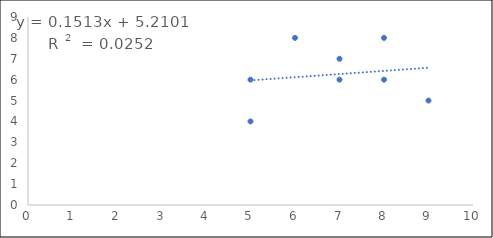
| Category | Series 0 |
|---|---|
| 8.0 | 6 |
| 7.0 | 6 |
| 6.0 | 8 |
| 9.0 | 5 |
| 5.0 | 6 |
| 5.0 | 4 |
| 7.0 | 7 |
| 8.0 | 8 |